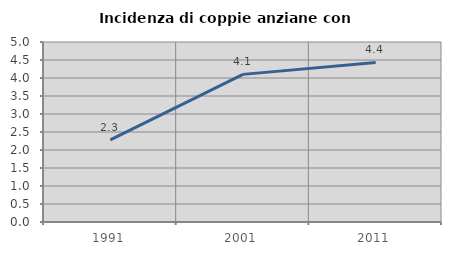
| Category | Incidenza di coppie anziane con figli |
|---|---|
| 1991.0 | 2.282 |
| 2001.0 | 4.101 |
| 2011.0 | 4.431 |